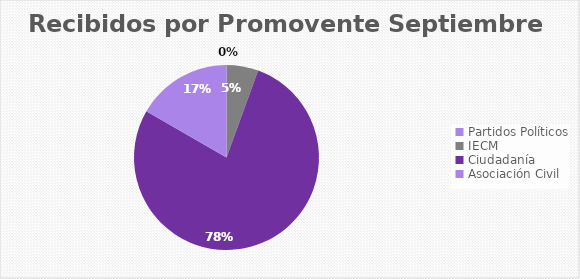
| Category | Recibidos por Promovente SEPTIEMBRE |
|---|---|
| Partidos Políticos | 0 |
| IECM | 1 |
| Ciudadanía  | 14 |
| Asociación Civil | 3 |